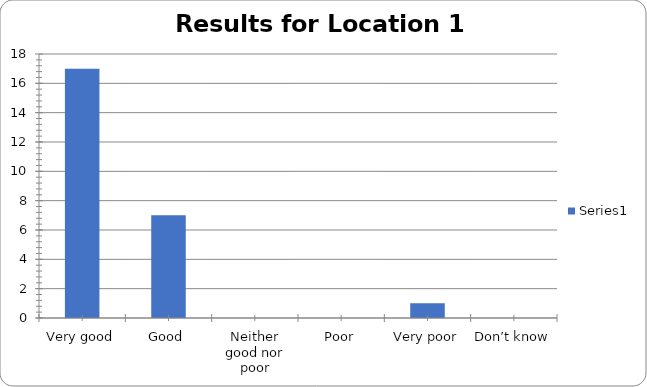
| Category | Series 0 |
|---|---|
| Very good | 17 |
| Good | 7 |
| Neither good nor poor | 0 |
| Poor | 0 |
| Very poor | 1 |
| Don’t know | 0 |